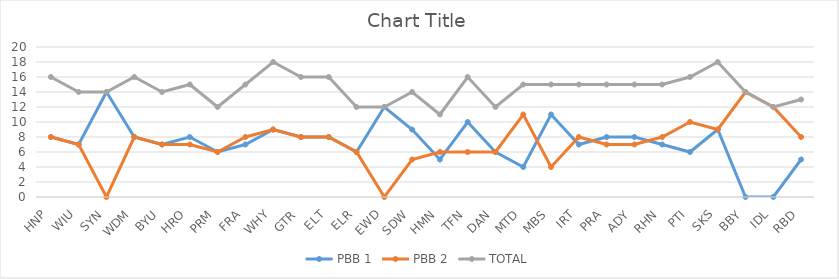
| Category | PBB 1 | PBB 2 | TOTAL |
|---|---|---|---|
| HNP | 8 | 8 | 16 |
| WIU | 7 | 7 | 14 |
| SYN | 14 | 0 | 14 |
| WDM | 8 | 8 | 16 |
| BYU | 7 | 7 | 14 |
| HRO | 8 | 7 | 15 |
| PRM | 6 | 6 | 12 |
| FRA | 7 | 8 | 15 |
| WHY | 9 | 9 | 18 |
| GTR | 8 | 8 | 16 |
| ELT | 8 | 8 | 16 |
| ELR | 6 | 6 | 12 |
| EWD | 12 | 0 | 12 |
| SDW | 9 | 5 | 14 |
| HMN | 5 | 6 | 11 |
| TFN | 10 | 6 | 16 |
| DAN | 6 | 6 | 12 |
| MTD | 4 | 11 | 15 |
| MBS | 11 | 4 | 15 |
| IRT | 7 | 8 | 15 |
| PRA | 8 | 7 | 15 |
| ADY | 8 | 7 | 15 |
| RHN | 7 | 8 | 15 |
| PTI | 6 | 10 | 16 |
| SKS | 9 | 9 | 18 |
| BBY | 0 | 14 | 14 |
| IDL | 0 | 12 | 12 |
| RBD | 5 | 8 | 13 |